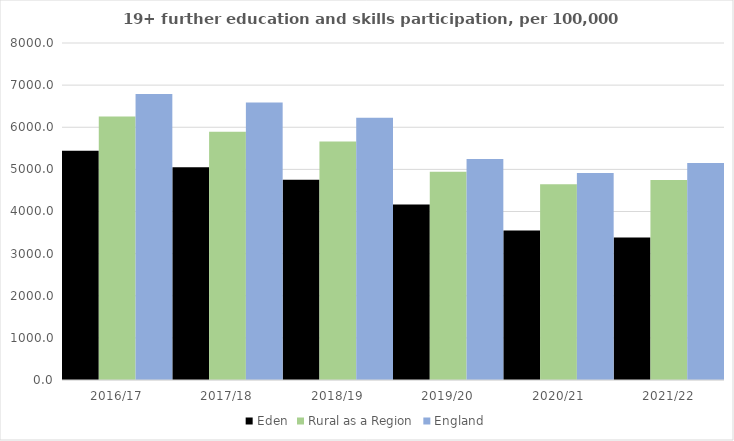
| Category | Eden | Rural as a Region | England |
|---|---|---|---|
| 2016/17 | 5445 | 6253.401 | 6788 |
| 2017/18 | 5053 | 5892.029 | 6588 |
| 2018/19 | 4755 | 5661.873 | 6227 |
| 2019/20 | 4166 | 4943.801 | 5244 |
| 2020/21 | 3551 | 4646.727 | 4913 |
| 2021/22 | 3385 | 4747.049 | 5151 |